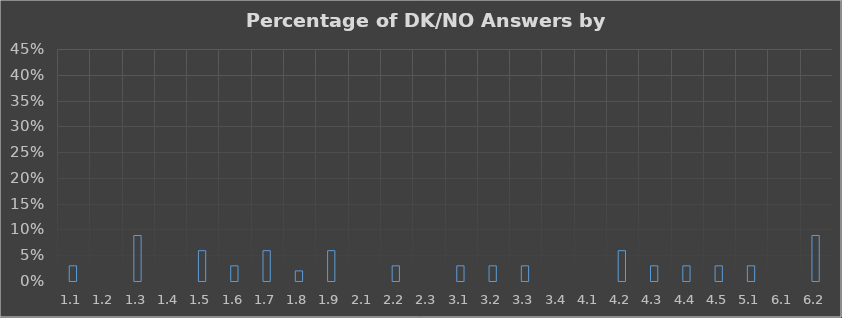
| Category | Series 0 |
|---|---|
| 1.1 | 0.029 |
| 1.2 | 0 |
| 1.3 | 0.088 |
| 1.4 | 0 |
| 1.5 | 0.059 |
| 1.6 | 0.029 |
| 1.7 | 0.059 |
| 1.8 | 0.02 |
| 1.9 | 0.059 |
| 2.1 | 0 |
| 2.2 | 0.029 |
| 2.3 | 0 |
| 3.1 | 0.029 |
| 3.2 | 0.029 |
| 3.3 | 0.029 |
| 3.4 | 0 |
| 4.1 | 0 |
| 4.2 | 0.059 |
| 4.3 | 0.029 |
| 4.4 | 0.029 |
| 4.5 | 0.029 |
| 5.1 | 0.029 |
| 6.1 | 0 |
| 6.2 | 0.088 |